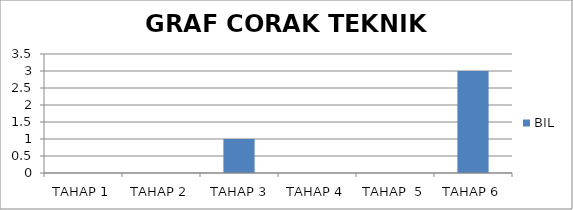
| Category | BIL |
|---|---|
| TAHAP 1 | 0 |
| TAHAP 2 | 0 |
|  TAHAP 3 | 1 |
| TAHAP 4 | 0 |
| TAHAP  5 | 0 |
| TAHAP 6 | 3 |